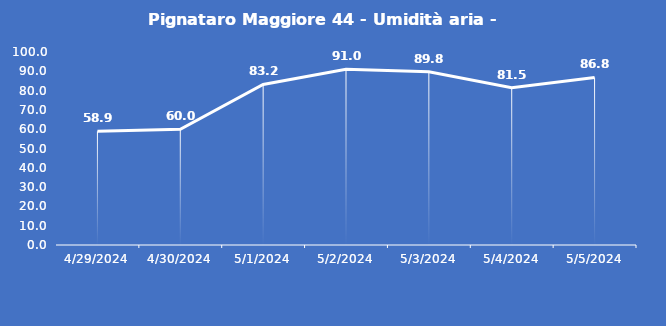
| Category | Pignataro Maggiore 44 - Umidità aria - Grezzo (%) |
|---|---|
| 4/29/24 | 58.9 |
| 4/30/24 | 60 |
| 5/1/24 | 83.2 |
| 5/2/24 | 91 |
| 5/3/24 | 89.8 |
| 5/4/24 | 81.5 |
| 5/5/24 | 86.8 |